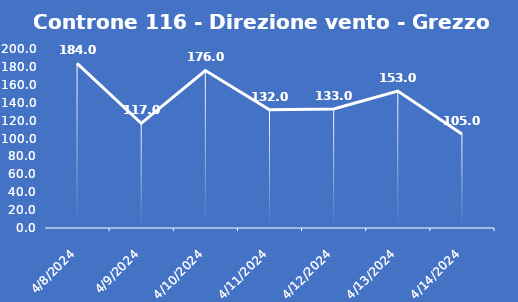
| Category | Controne 116 - Direzione vento - Grezzo (°N) |
|---|---|
| 4/8/24 | 184 |
| 4/9/24 | 117 |
| 4/10/24 | 176 |
| 4/11/24 | 132 |
| 4/12/24 | 133 |
| 4/13/24 | 153 |
| 4/14/24 | 105 |